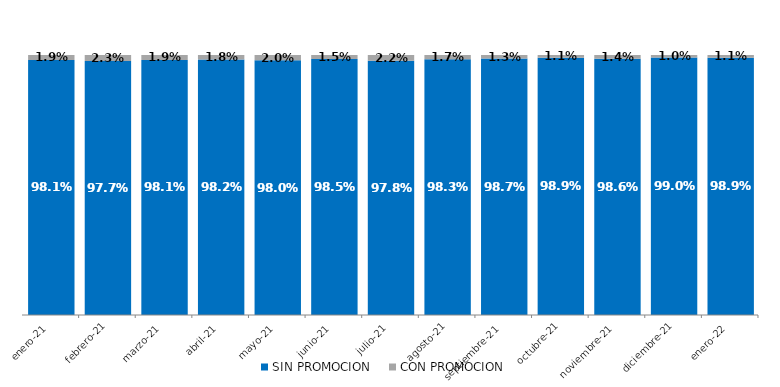
| Category | SIN PROMOCION   | CON PROMOCION   |
|---|---|---|
| 2021-01-01 | 0.981 | 0.019 |
| 2021-02-01 | 0.977 | 0.023 |
| 2021-03-01 | 0.981 | 0.019 |
| 2021-04-01 | 0.982 | 0.018 |
| 2021-05-01 | 0.98 | 0.02 |
| 2021-06-01 | 0.985 | 0.015 |
| 2021-07-01 | 0.978 | 0.022 |
| 2021-08-01 | 0.983 | 0.017 |
| 2021-09-01 | 0.987 | 0.013 |
| 2021-10-01 | 0.989 | 0.011 |
| 2021-11-01 | 0.986 | 0.014 |
| 2021-12-01 | 0.99 | 0.01 |
| 2022-01-01 | 0.989 | 0.011 |